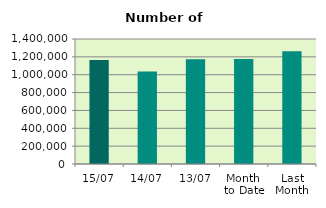
| Category | Series 0 |
|---|---|
| 15/07 | 1164774 |
| 14/07 | 1035844 |
| 13/07 | 1172044 |
| Month 
to Date | 1176209.273 |
| Last
Month | 1263143.455 |